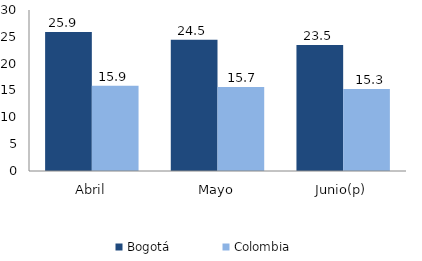
| Category | Bogotá | Colombia |
|---|---|---|
| Abril | 25.897 | 15.867 |
| Mayo | 24.473 | 15.655 |
| Junio(p) | 23.49 | 15.269 |